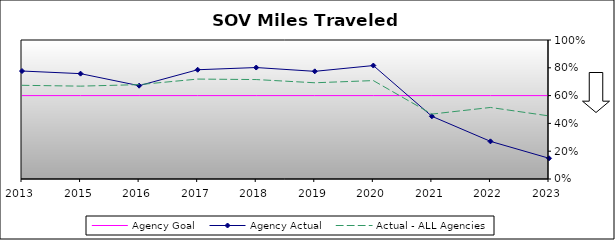
| Category | Agency Goal | Agency Actual | Actual - ALL Agencies |
|---|---|---|---|
| 2013.0 | 0.6 | 0.777 | 0.674 |
| 2015.0 | 0.6 | 0.758 | 0.668 |
| 2016.0 | 0.6 | 0.671 | 0.679 |
| 2017.0 | 0.6 | 0.786 | 0.719 |
| 2018.0 | 0.6 | 0.802 | 0.715 |
| 2019.0 | 0.6 | 0.775 | 0.692 |
| 2020.0 | 0.6 | 0.816 | 0.708 |
| 2021.0 | 0.6 | 0.451 | 0.467 |
| 2022.0 | 0.6 | 0.271 | 0.515 |
| 2023.0 | 0.6 | 0.149 | 0.454 |